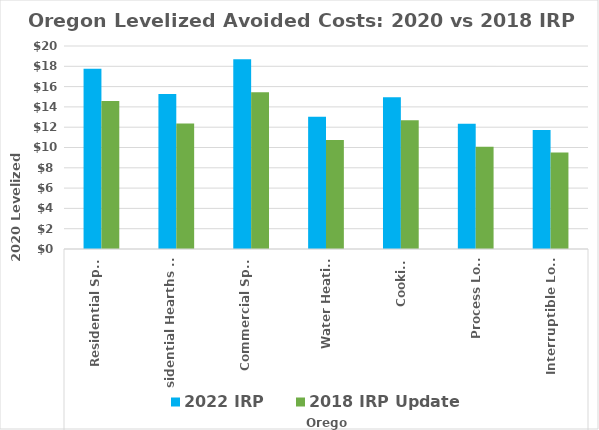
| Category | 2022 IRP | 2018 IRP Update |
|---|---|---|
| 0 | 17.748 | 14.575 |
| 1 | 15.268 | 12.374 |
| 2 | 18.7 | 15.443 |
| 3 | 13.017 | 10.743 |
| 4 | 14.957 | 12.688 |
| 5 | 12.329 | 10.07 |
| 6 | 11.735 | 9.51 |